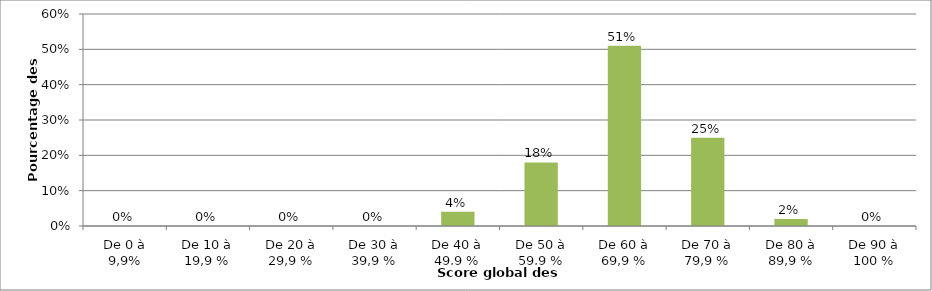
| Category | Series 0 |
|---|---|
| De 0 à 9,9% | 0 |
| De 10 à 19,9 % | 0 |
| De 20 à 29,9 % | 0 |
| De 30 à 39,9 % | 0 |
| De 40 à 49,9 % | 0.04 |
| De 50 à 59,9 % | 0.18 |
| De 60 à 69,9 % | 0.51 |
| De 70 à 79,9 % | 0.25 |
| De 80 à 89,9 % | 0.02 |
| De 90 à 100 % | 0 |